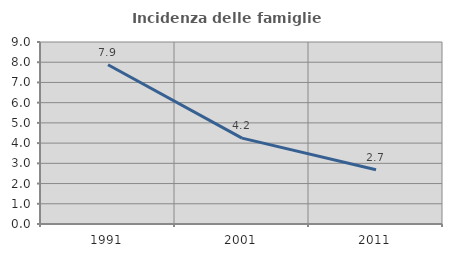
| Category | Incidenza delle famiglie numerose |
|---|---|
| 1991.0 | 7.872 |
| 2001.0 | 4.247 |
| 2011.0 | 2.686 |